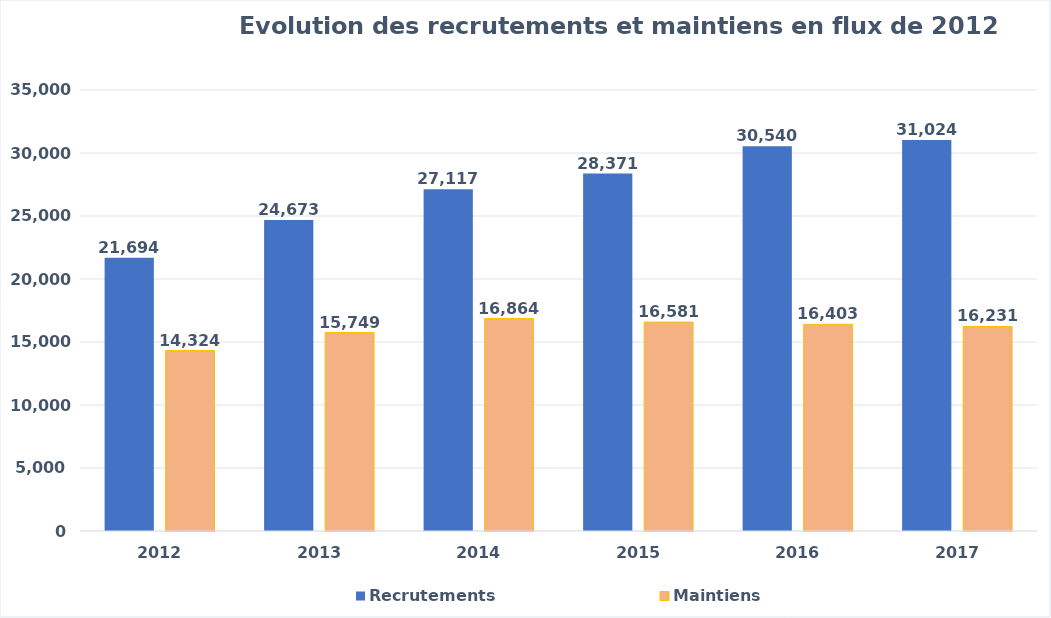
| Category | Recrutements | Maintiens |
|---|---|---|
| 2012.0 | 21694 | 14324 |
| 2013.0 | 24673 | 15749 |
| 2014.0 | 27117 | 16864 |
| 2015.0 | 28371 | 16581 |
| 2016.0 | 30540 | 16403 |
| 2017.0 | 31024 | 16231 |